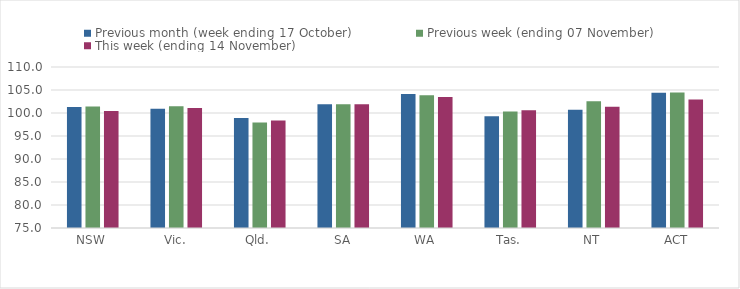
| Category | Previous month (week ending 17 October) | Previous week (ending 07 November) | This week (ending 14 November) |
|---|---|---|---|
| NSW | 101.28 | 101.44 | 100.45 |
| Vic. | 100.9 | 101.49 | 101.11 |
| Qld. | 98.92 | 97.95 | 98.39 |
| SA | 101.88 | 101.88 | 101.88 |
| WA | 104.14 | 103.87 | 103.47 |
| Tas. | 99.28 | 100.31 | 100.58 |
| NT | 100.73 | 102.55 | 101.37 |
| ACT | 104.4 | 104.46 | 102.95 |